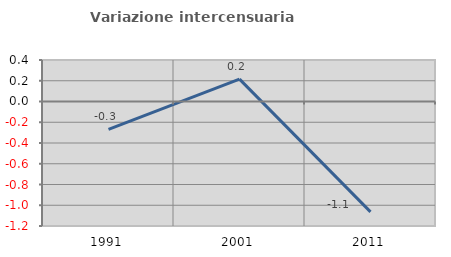
| Category | Variazione intercensuaria annua |
|---|---|
| 1991.0 | -0.269 |
| 2001.0 | 0.216 |
| 2011.0 | -1.064 |